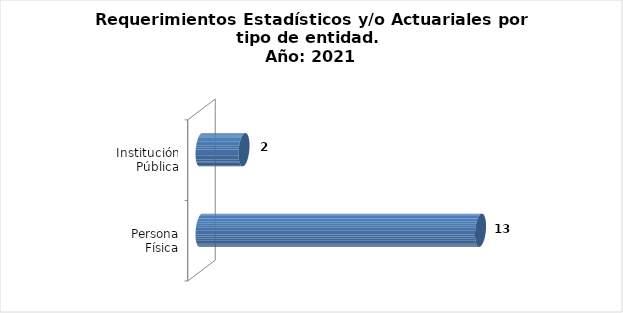
| Category | Total |
|---|---|
| Persona Física | 13 |
| Institución Pública | 2 |